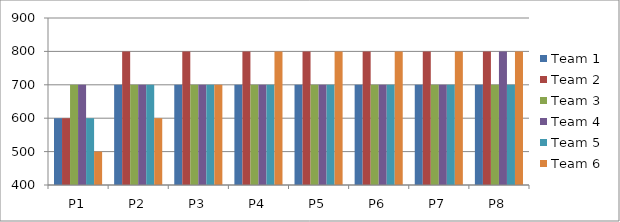
| Category | Team 1 | Team 2 | Team 3 | Team 4 | Team 5 | Team 6 |
|---|---|---|---|---|---|---|
| P1 | 600 | 600 | 700 | 700 | 600 | 500 |
| P2 | 700 | 800 | 700 | 700 | 700 | 600 |
| P3 | 700 | 800 | 700 | 700 | 700 | 700 |
| P4 | 700 | 800 | 700 | 700 | 700 | 800 |
| P5 | 700 | 800 | 700 | 700 | 700 | 800 |
| P6 | 700 | 800 | 700 | 700 | 700 | 800 |
| P7 | 700 | 800 | 700 | 700 | 700 | 800 |
| P8 | 700 | 800 | 700 | 800 | 700 | 800 |